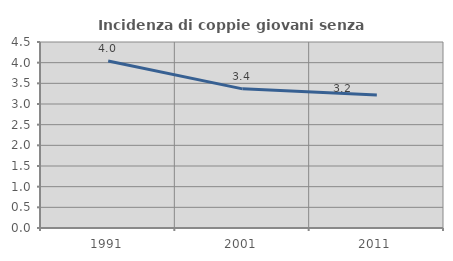
| Category | Incidenza di coppie giovani senza figli |
|---|---|
| 1991.0 | 4.042 |
| 2001.0 | 3.366 |
| 2011.0 | 3.216 |